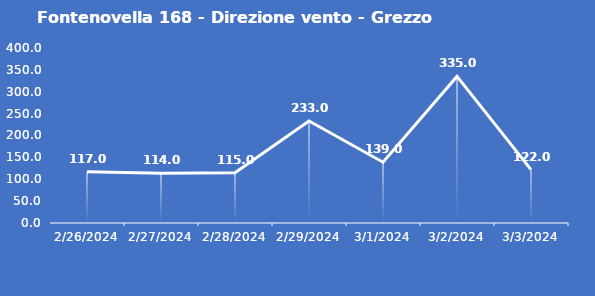
| Category | Fontenovella 168 - Direzione vento - Grezzo (°N) |
|---|---|
| 2/26/24 | 117 |
| 2/27/24 | 114 |
| 2/28/24 | 115 |
| 2/29/24 | 233 |
| 3/1/24 | 139 |
| 3/2/24 | 335 |
| 3/3/24 | 122 |